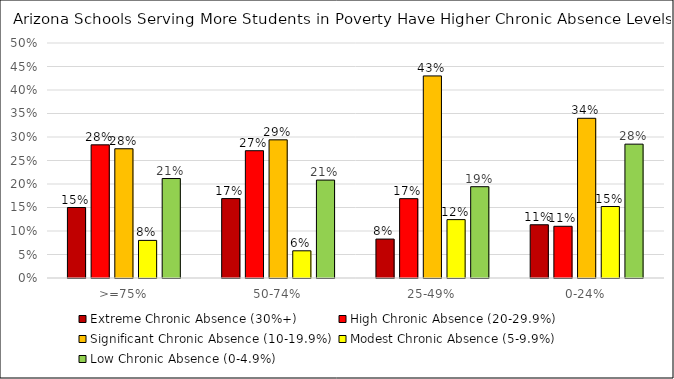
| Category | Extreme Chronic Absence (30%+) | High Chronic Absence (20-29.9%) | Significant Chronic Absence (10-19.9%) | Modest Chronic Absence (5-9.9%) | Low Chronic Absence (0-4.9%) |
|---|---|---|---|---|---|
| >=75% | 0.15 | 0.283 | 0.275 | 0.08 | 0.212 |
| 50-74% | 0.169 | 0.271 | 0.294 | 0.058 | 0.208 |
| 25-49% | 0.083 | 0.169 | 0.43 | 0.124 | 0.194 |
| 0-24% | 0.113 | 0.11 | 0.34 | 0.152 | 0.285 |